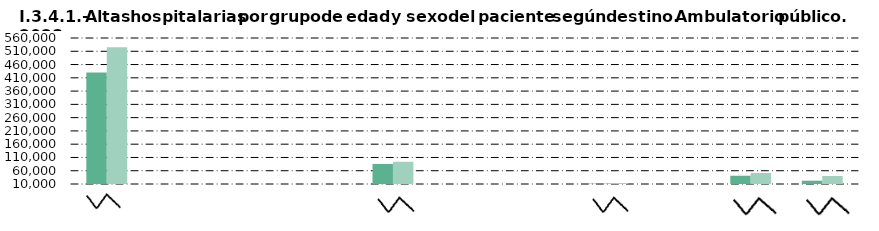
| Category | Hombre | Mujer |
|---|---|---|
| Alta médica | 429629 | 525375 |
| Alta voluntaria | 92 | 126 |
| Fallecimiento | 1 | 2 |
| Centro sociosanitario | 11 | 2 |
| Consulta hospitalaria | 85620 | 93812 |
| Urgencias | 320 | 299 |
| Cirugía ambulatoria | 1 | 2 |
| Atención primaria | 11517 | 13586 |
| Otro hospital | 1926 | 2186 |
| Continuación de tratamiento | 41130 | 51639 |
| No consta | 22493 | 40044 |